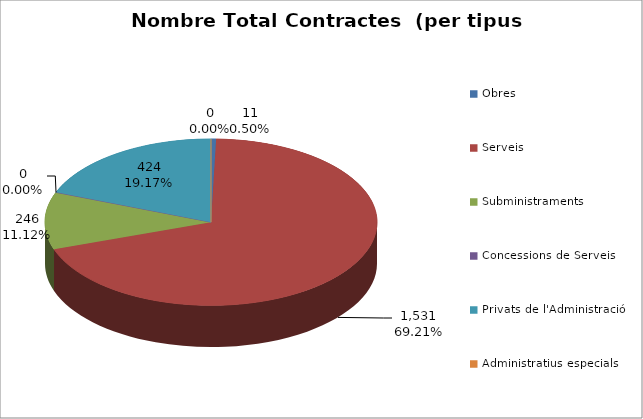
| Category | Nombre Total Contractes |
|---|---|
| Obres | 11 |
| Serveis | 1531 |
| Subministraments | 246 |
| Concessions de Serveis | 0 |
| Privats de l'Administració | 424 |
| Administratius especials | 0 |